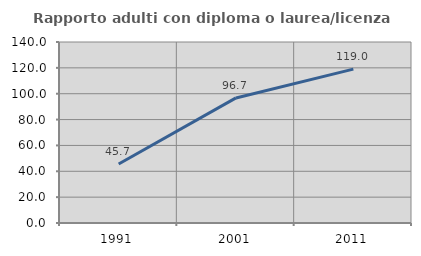
| Category | Rapporto adulti con diploma o laurea/licenza media  |
|---|---|
| 1991.0 | 45.679 |
| 2001.0 | 96.739 |
| 2011.0 | 119.048 |